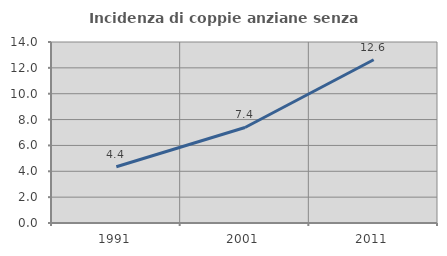
| Category | Incidenza di coppie anziane senza figli  |
|---|---|
| 1991.0 | 4.352 |
| 2001.0 | 7.389 |
| 2011.0 | 12.627 |